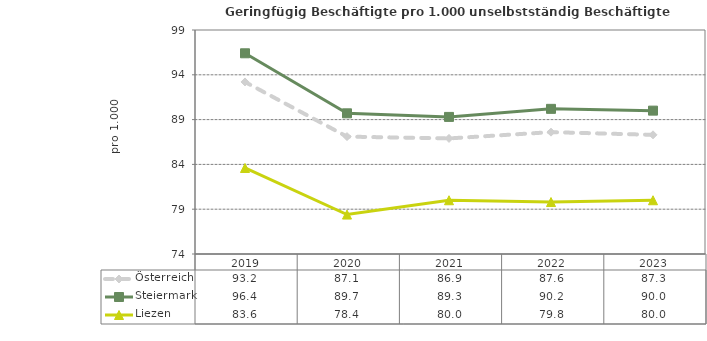
| Category | Österreich | Steiermark | Liezen |
|---|---|---|---|
| 2023.0 | 87.3 | 90 | 80 |
| 2022.0 | 87.6 | 90.2 | 79.8 |
| 2021.0 | 86.9 | 89.3 | 80 |
| 2020.0 | 87.1 | 89.7 | 78.4 |
| 2019.0 | 93.2 | 96.4 | 83.6 |